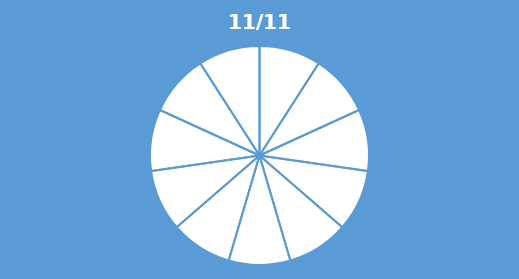
| Category | Series 0 |
|---|---|
| 0 | 0.091 |
| 1 | 0.091 |
| 2 | 0.091 |
| 3 | 0.091 |
| 4 | 0.091 |
| 5 | 0.091 |
| 6 | 0.091 |
| 7 | 0.091 |
| 8 | 0.091 |
| 9 | 0.091 |
| 10 | 0.091 |